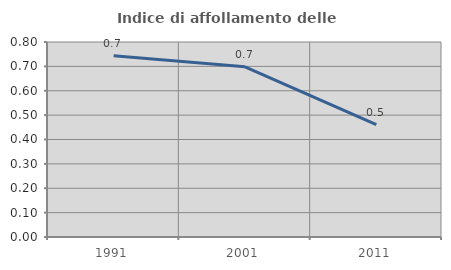
| Category | Indice di affollamento delle abitazioni  |
|---|---|
| 1991.0 | 0.744 |
| 2001.0 | 0.698 |
| 2011.0 | 0.461 |